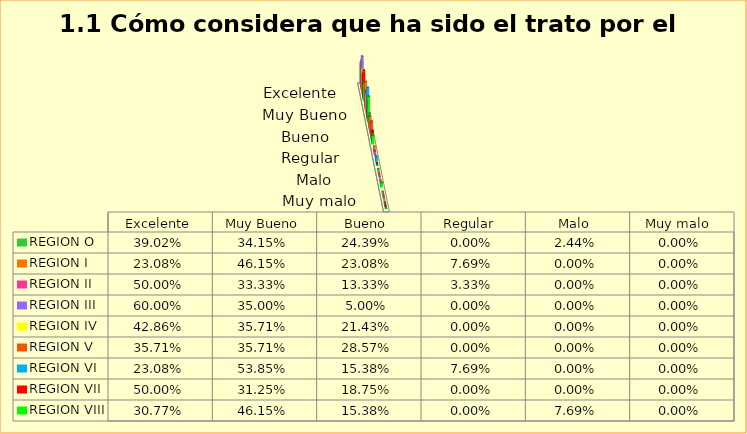
| Category | REGION O | REGION I  | REGION II | REGION III | REGION IV | REGION V  | REGION VI  | REGION VII  | REGION VIII |
|---|---|---|---|---|---|---|---|---|---|
| Excelente | 0.39 | 0.231 | 0.5 | 0.6 | 0.429 | 0.357 | 0.231 | 0.5 | 0.308 |
| Muy Bueno | 0.341 | 0.462 | 0.333 | 0.35 | 0.357 | 0.357 | 0.538 | 0.312 | 0.462 |
| Bueno  | 0.244 | 0.231 | 0.133 | 0.05 | 0.214 | 0.286 | 0.154 | 0.188 | 0.154 |
| Regular  | 0 | 0.077 | 0.033 | 0 | 0 | 0 | 0.077 | 0 | 0 |
| Malo  | 0.024 | 0 | 0 | 0 | 0 | 0 | 0 | 0 | 0.077 |
| Muy malo  | 0 | 0 | 0 | 0 | 0 | 0 | 0 | 0 | 0 |